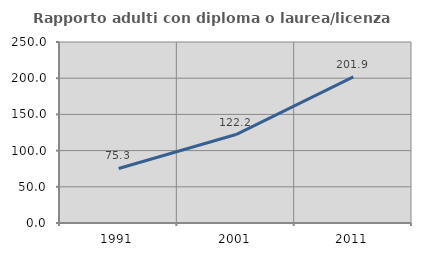
| Category | Rapporto adulti con diploma o laurea/licenza media  |
|---|---|
| 1991.0 | 75.347 |
| 2001.0 | 122.191 |
| 2011.0 | 201.888 |